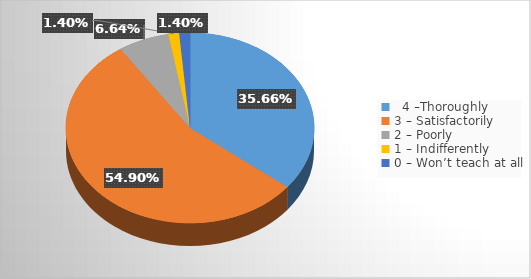
| Category | Series 0 |
|---|---|
|   4 –Thoroughly | 0.357 |
| 3 – Satisfactorily | 0.549 |
| 2 – Poorly | 0.066 |
| 1 – Indifferently | 0.014 |
| 0 – Won’t teach at all | 0.014 |